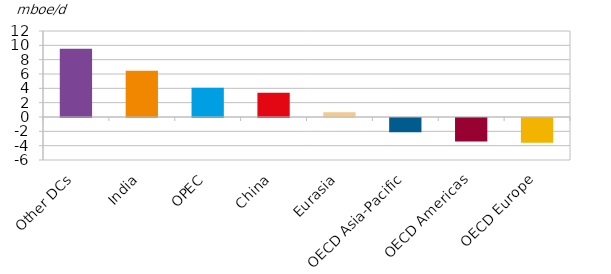
| Category | Series 0 |
|---|---|
| Other DCs | 9.53 |
| India | 6.464 |
| OPEC | 4.072 |
| China | 3.393 |
| Eurasia | 0.67 |
| OECD Asia-Pacific | -1.981 |
| OECD Americas | -3.269 |
| OECD Europe | -3.459 |